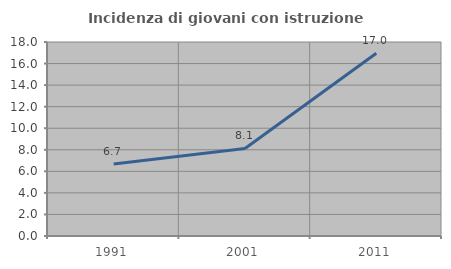
| Category | Incidenza di giovani con istruzione universitaria |
|---|---|
| 1991.0 | 6.688 |
| 2001.0 | 8.122 |
| 2011.0 | 16.956 |